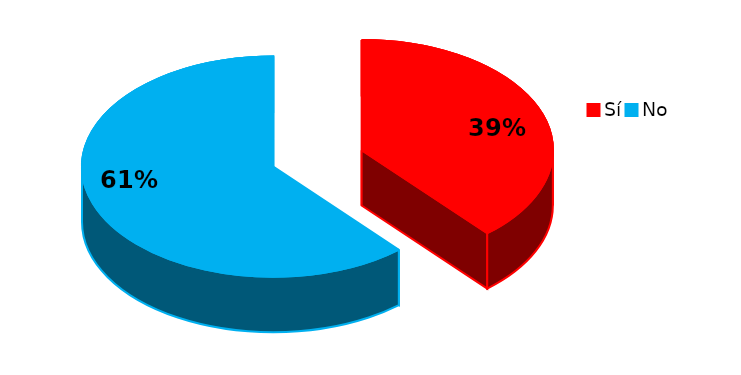
| Category | Series 0 |
|---|---|
| Sí | 22 |
| No | 35 |